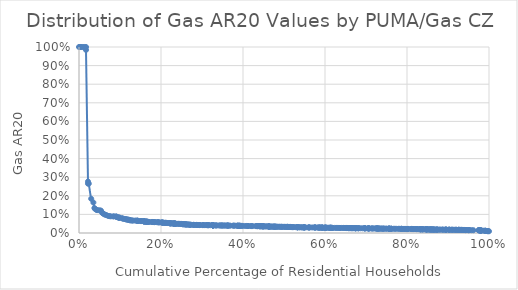
| Category | AR20_gas |
|---|---|
| 1.07221961974995e-06 | 1 |
| 0.00229821348100612 | 1 |
| 0.00495956144478507 | 1 |
| 0.00914545835981477 | 1 |
| 0.0128140702190956 | 1 |
| 0.0170680034945832 | 1 |
| 0.0170727015459645 | 0.984 |
| 0.0219218501013144 | 0.277 |
| 0.0219221861391418 | 0.265 |
| 0.0238782995773975 | 0.265 |
| 0.0297063076322547 | 0.184 |
| 0.0350762595945656 | 0.164 |
| 0.0375487733970018 | 0.134 |
| 0.0399042815849126 | 0.128 |
| 0.0431721046350667 | 0.124 |
| 0.0445546733369328 | 0.123 |
| 0.0498333489754946 | 0.122 |
| 0.053637433487389 | 0.12 |
| 0.0570916689322593 | 0.109 |
| 0.0570957579415493 | 0.107 |
| 0.0604774436069643 | 0.102 |
| 0.0633326286990549 | 0.098 |
| 0.0666840813338274 | 0.096 |
| 0.0708823360171524 | 0.092 |
| 0.0741296233131863 | 0.091 |
| 0.0774314246008016 | 0.09 |
| 0.0834084389524328 | 0.089 |
| 0.0853850144532829 | 0.089 |
| 0.0906554605272265 | 0.089 |
| 0.0909734117919871 | 0.088 |
| 0.0915695404561655 | 0.087 |
| 0.0942895828025872 | 0.084 |
| 0.0953060748716451 | 0.084 |
| 0.0984847313474749 | 0.083 |
| 0.0984847355122949 | 0.082 |
| 0.0984863683871913 | 0.082 |
| 0.105130470739923 | 0.08 |
| 0.107149330250677 | 0.076 |
| 0.110971298557398 | 0.076 |
| 0.113926304413762 | 0.074 |
| 0.113926386207292 | 0.074 |
| 0.117500291207898 | 0.074 |
| 0.117878088989415 | 0.071 |
| 0.121301221283638 | 0.071 |
| 0.121576998012026 | 0.071 |
| 0.124241406715937 | 0.069 |
| 0.124243061011068 | 0.069 |
| 0.124295362795494 | 0.068 |
| 0.127086856509742 | 0.068 |
| 0.129795324287599 | 0.067 |
| 0.131597916541999 | 0.067 |
| 0.136994132831474 | 0.067 |
| 0.140434609438351 | 0.066 |
| 0.142663597241338 | 0.066 |
| 0.142668424651051 | 0.066 |
| 0.143123789897546 | 0.065 |
| 0.145659852043393 | 0.065 |
| 0.150760001096954 | 0.064 |
| 0.151354902251628 | 0.064 |
| 0.153232376307528 | 0.064 |
| 0.157517354116171 | 0.064 |
| 0.157517355531586 | 0.063 |
| 0.159366279195612 | 0.063 |
| 0.159366381938477 | 0.062 |
| 0.159366390749053 | 0.062 |
| 0.159367736940809 | 0.062 |
| 0.161773311087287 | 0.061 |
| 0.164467431703901 | 0.061 |
| 0.164467431836481 | 0.061 |
| 0.165356145862274 | 0.061 |
| 0.165356356501126 | 0.06 |
| 0.166342619954551 | 0.06 |
| 0.166367857257938 | 0.06 |
| 0.16985393023808 | 0.06 |
| 0.169853931214702 | 0.059 |
| 0.175934673138637 | 0.059 |
| 0.179551097115245 | 0.059 |
| 0.180666957547139 | 0.059 |
| 0.180666965294076 | 0.059 |
| 0.183389938676059 | 0.059 |
| 0.184244937842272 | 0.059 |
| 0.18862586970693 | 0.059 |
| 0.192714094420495 | 0.058 |
| 0.192715718808669 | 0.057 |
| 0.194997710859526 | 0.057 |
| 0.198409764934514 | 0.057 |
| 0.20275278138085 | 0.057 |
| 0.202752786993327 | 0.056 |
| 0.202753202190336 | 0.056 |
| 0.205021124487211 | 0.056 |
| 0.205021137208874 | 0.055 |
| 0.207079700849243 | 0.055 |
| 0.210325709612666 | 0.055 |
| 0.210325711256483 | 0.054 |
| 0.210325712347611 | 0.054 |
| 0.212969342613954 | 0.054 |
| 0.212969342995228 | 0.054 |
| 0.216511229811084 | 0.054 |
| 0.219279633012634 | 0.053 |
| 0.221842385808467 | 0.053 |
| 0.221899760518096 | 0.053 |
| 0.221899775014913 | 0.053 |
| 0.221903272887168 | 0.053 |
| 0.22190327420566 | 0.053 |
| 0.222284717693405 | 0.052 |
| 0.222284717703745 | 0.052 |
| 0.225039621912991 | 0.052 |
| 0.225039639587967 | 0.051 |
| 0.229015744185198 | 0.051 |
| 0.229774970634997 | 0.051 |
| 0.229774973747062 | 0.051 |
| 0.232806664876912 | 0.051 |
| 0.232985156776789 | 0.051 |
| 0.233023216914966 | 0.051 |
| 0.233023220166908 | 0.051 |
| 0.233384410814453 | 0.05 |
| 0.2333898686957 | 0.05 |
| 0.233390181970958 | 0.05 |
| 0.236155425920881 | 0.05 |
| 0.236749183569731 | 0.049 |
| 0.241138220060792 | 0.049 |
| 0.243436032559588 | 0.049 |
| 0.245991212025901 | 0.049 |
| 0.249370177762803 | 0.049 |
| 0.249370177882291 | 0.048 |
| 0.252065707128243 | 0.048 |
| 0.252092780757566 | 0.048 |
| 0.252336226693037 | 0.048 |
| 0.25234129769636 | 0.047 |
| 0.255815766408475 | 0.047 |
| 0.255815766964418 | 0.047 |
| 0.255858216361787 | 0.047 |
| 0.2578056115267 | 0.047 |
| 0.259742548926753 | 0.047 |
| 0.261138539727034 | 0.046 |
| 0.261532090078019 | 0.046 |
| 0.261532090084688 | 0.046 |
| 0.264553827874726 | 0.046 |
| 0.266084641521215 | 0.046 |
| 0.267815669861857 | 0.045 |
| 0.270593608622219 | 0.045 |
| 0.27088969339816 | 0.044 |
| 0.270906796983555 | 0.044 |
| 0.27435142920925 | 0.044 |
| 0.27903495240882 | 0.044 |
| 0.280348485362342 | 0.044 |
| 0.280555743642689 | 0.044 |
| 0.286716241098927 | 0.043 |
| 0.286719402378244 | 0.043 |
| 0.286770067947642 | 0.043 |
| 0.289793891210786 | 0.043 |
| 0.293843465525211 | 0.043 |
| 0.293866865376495 | 0.043 |
| 0.294205505302198 | 0.043 |
| 0.300890932124682 | 0.043 |
| 0.302617258870653 | 0.043 |
| 0.30261726331832 | 0.042 |
| 0.305538459456675 | 0.042 |
| 0.30960334605505 | 0.042 |
| 0.312525499456254 | 0.042 |
| 0.312531741853673 | 0.042 |
| 0.313224067947704 | 0.042 |
| 0.31602609831227 | 0.042 |
| 0.316026098312277 | 0.042 |
| 0.320193459585009 | 0.042 |
| 0.326077979653003 | 0.042 |
| 0.326077980576515 | 0.042 |
| 0.326079907208463 | 0.042 |
| 0.326080332019684 | 0.042 |
| 0.326081624671854 | 0.041 |
| 0.3260816246977 | 0.041 |
| 0.326088504138804 | 0.041 |
| 0.326742455122537 | 0.041 |
| 0.32688548440133 | 0.041 |
| 0.326887345700056 | 0.041 |
| 0.326892810803274 | 0.041 |
| 0.326894066683298 | 0.041 |
| 0.326894066696052 | 0.041 |
| 0.328283247870449 | 0.041 |
| 0.333321364848149 | 0.041 |
| 0.333323392898359 | 0.041 |
| 0.336030110988338 | 0.041 |
| 0.340967442799731 | 0.041 |
| 0.345111175249178 | 0.041 |
| 0.345111192334561 | 0.04 |
| 0.348261164688001 | 0.04 |
| 0.349379495713091 | 0.04 |
| 0.351149042784586 | 0.04 |
| 0.355128935069928 | 0.04 |
| 0.355448829267696 | 0.04 |
| 0.360276325762677 | 0.04 |
| 0.36089639270179 | 0.04 |
| 0.362942360405995 | 0.04 |
| 0.362943177457352 | 0.04 |
| 0.363513653648535 | 0.04 |
| 0.366221169476838 | 0.04 |
| 0.369095963513591 | 0.04 |
| 0.376299383425574 | 0.039 |
| 0.377265328641615 | 0.039 |
| 0.380548674010209 | 0.039 |
| 0.386022208700038 | 0.039 |
| 0.387357798298135 | 0.039 |
| 0.387358758765987 | 0.039 |
| 0.387358759304785 | 0.039 |
| 0.389826169163444 | 0.039 |
| 0.389832778336073 | 0.039 |
| 0.39179692574107 | 0.039 |
| 0.392457885529537 | 0.039 |
| 0.392458276539528 | 0.039 |
| 0.392458282084949 | 0.039 |
| 0.397135192886427 | 0.038 |
| 0.397999608421589 | 0.038 |
| 0.403871190771162 | 0.038 |
| 0.408248648741379 | 0.038 |
| 0.412239773057733 | 0.038 |
| 0.412240045564753 | 0.038 |
| 0.412240045564805 | 0.037 |
| 0.419231090411133 | 0.037 |
| 0.420933009572028 | 0.037 |
| 0.423596812652653 | 0.037 |
| 0.431086623107177 | 0.037 |
| 0.432499173242644 | 0.037 |
| 0.434762161598998 | 0.037 |
| 0.434762161599005 | 0.037 |
| 0.434762208153378 | 0.037 |
| 0.437027659452751 | 0.037 |
| 0.441032391076984 | 0.037 |
| 0.441032415842248 | 0.037 |
| 0.441582690644422 | 0.037 |
| 0.441613722043656 | 0.037 |
| 0.441613732173857 | 0.037 |
| 0.441614803755935 | 0.036 |
| 0.443896006644949 | 0.036 |
| 0.446837592929059 | 0.036 |
| 0.446872993175616 | 0.036 |
| 0.44687299317707 | 0.036 |
| 0.449844345203343 | 0.036 |
| 0.449873299286843 | 0.036 |
| 0.449878115079621 | 0.036 |
| 0.449990762192102 | 0.036 |
| 0.454794489147716 | 0.036 |
| 0.456616190849116 | 0.036 |
| 0.460385204964723 | 0.035 |
| 0.460776435422929 | 0.035 |
| 0.463161572116121 | 0.035 |
| 0.463161572919477 | 0.035 |
| 0.463179356953205 | 0.035 |
| 0.463796245760843 | 0.035 |
| 0.463796245795549 | 0.035 |
| 0.463840202124383 | 0.035 |
| 0.465221047882297 | 0.034 |
| 0.468162473354882 | 0.034 |
| 0.468205479998807 | 0.034 |
| 0.471519280172202 | 0.034 |
| 0.473814808363266 | 0.034 |
| 0.474721269534296 | 0.034 |
| 0.474721269538523 | 0.034 |
| 0.477841404722715 | 0.034 |
| 0.47784157506852 | 0.034 |
| 0.47786836675818 | 0.034 |
| 0.479396822980544 | 0.034 |
| 0.482690441109342 | 0.034 |
| 0.482725301158768 | 0.034 |
| 0.486993257882883 | 0.034 |
| 0.489340442603009 | 0.034 |
| 0.492352113960485 | 0.033 |
| 0.494508714172082 | 0.033 |
| 0.494821102214574 | 0.033 |
| 0.49816121642525 | 0.033 |
| 0.502097864895892 | 0.033 |
| 0.502285084625378 | 0.033 |
| 0.505653217805019 | 0.033 |
| 0.50867661914887 | 0.033 |
| 0.50921167343582 | 0.033 |
| 0.509211830484392 | 0.033 |
| 0.509214033439142 | 0.033 |
| 0.512970792939347 | 0.033 |
| 0.515875758469227 | 0.032 |
| 0.515876356829089 | 0.032 |
| 0.515876948598935 | 0.032 |
| 0.517886273398197 | 0.032 |
| 0.521126778255708 | 0.032 |
| 0.521128407797599 | 0.032 |
| 0.523471865801551 | 0.032 |
| 0.527681518805049 | 0.032 |
| 0.532330967986976 | 0.032 |
| 0.532344097545549 | 0.031 |
| 0.532344264404888 | 0.031 |
| 0.532353390166678 | 0.031 |
| 0.532355758177682 | 0.031 |
| 0.53293922577067 | 0.031 |
| 0.532939779294352 | 0.031 |
| 0.537260379074112 | 0.031 |
| 0.537260382950928 | 0.031 |
| 0.541020060424672 | 0.031 |
| 0.544742911951681 | 0.03 |
| 0.544757639241748 | 0.03 |
| 0.549092439645964 | 0.03 |
| 0.549092439719184 | 0.03 |
| 0.549361012319747 | 0.03 |
| 0.549393921008242 | 0.03 |
| 0.549393933065349 | 0.03 |
| 0.552511628513161 | 0.03 |
| 0.559284746157375 | 0.03 |
| 0.561293869852034 | 0.03 |
| 0.561432421776985 | 0.03 |
| 0.562488190935126 | 0.03 |
| 0.568752213069486 | 0.03 |
| 0.573192299036748 | 0.03 |
| 0.575602712308159 | 0.03 |
| 0.575746566414193 | 0.03 |
| 0.575746764906252 | 0.03 |
| 0.578655555747378 | 0.03 |
| 0.583388373500017 | 0.029 |
| 0.583388617114383 | 0.029 |
| 0.586916103459222 | 0.029 |
| 0.58691806456389 | 0.029 |
| 0.586918067304262 | 0.029 |
| 0.587250009627688 | 0.029 |
| 0.591780606787383 | 0.029 |
| 0.593010436126723 | 0.029 |
| 0.593015026709664 | 0.029 |
| 0.59301529966119 | 0.029 |
| 0.593015299815065 | 0.029 |
| 0.595157227189415 | 0.029 |
| 0.599161556498504 | 0.029 |
| 0.599167089676147 | 0.029 |
| 0.59935850242068 | 0.029 |
| 0.601789683962211 | 0.028 |
| 0.601792294790196 | 0.028 |
| 0.60192060226083 | 0.028 |
| 0.601920629756658 | 0.028 |
| 0.605266751936125 | 0.028 |
| 0.608474641553173 | 0.028 |
| 0.611023720944634 | 0.028 |
| 0.611337214577323 | 0.028 |
| 0.613674135016477 | 0.028 |
| 0.613743562648117 | 0.028 |
| 0.613827537302831 | 0.028 |
| 0.613827537382773 | 0.028 |
| 0.615125965251715 | 0.028 |
| 0.615241764245742 | 0.028 |
| 0.615241960117589 | 0.028 |
| 0.615726074035001 | 0.027 |
| 0.618476463390624 | 0.027 |
| 0.618492618162101 | 0.027 |
| 0.62371484997839 | 0.027 |
| 0.627280386085864 | 0.027 |
| 0.629855155287473 | 0.027 |
| 0.633679099885903 | 0.027 |
| 0.636618182728161 | 0.027 |
| 0.636618184742006 | 0.027 |
| 0.64021530744344 | 0.027 |
| 0.645288081642428 | 0.027 |
| 0.64528808300205 | 0.027 |
| 0.649291411132555 | 0.027 |
| 0.652824753747026 | 0.027 |
| 0.652825440044435 | 0.027 |
| 0.653379819004403 | 0.027 |
| 0.653379819562387 | 0.027 |
| 0.656979399223185 | 0.027 |
| 0.657255615299725 | 0.026 |
| 0.657285864698279 | 0.026 |
| 0.657288097155678 | 0.026 |
| 0.65991775887736 | 0.026 |
| 0.65991782358389 | 0.026 |
| 0.663253433089345 | 0.026 |
| 0.663265137426479 | 0.026 |
| 0.663265138914723 | 0.026 |
| 0.663994138326373 | 0.026 |
| 0.664006256729138 | 0.026 |
| 0.665777993491488 | 0.026 |
| 0.667907845771761 | 0.026 |
| 0.667907853092715 | 0.026 |
| 0.670609645104058 | 0.026 |
| 0.672335067692401 | 0.026 |
| 0.674614962186534 | 0.026 |
| 0.674615093927397 | 0.026 |
| 0.674615112333588 | 0.026 |
| 0.674615145031048 | 0.026 |
| 0.674615512409332 | 0.026 |
| 0.677967906916804 | 0.026 |
| 0.681613061002777 | 0.026 |
| 0.681613147269915 | 0.026 |
| 0.681613147273758 | 0.026 |
| 0.686403824339672 | 0.026 |
| 0.691368727598381 | 0.025 |
| 0.696666533081153 | 0.025 |
| 0.696666533820158 | 0.025 |
| 0.69666670406986 | 0.025 |
| 0.696666827618111 | 0.025 |
| 0.699456690185913 | 0.025 |
| 0.705290547745695 | 0.025 |
| 0.705295733514177 | 0.025 |
| 0.70636153483696 | 0.025 |
| 0.706838118408566 | 0.025 |
| 0.706838142291256 | 0.025 |
| 0.707181113646209 | 0.025 |
| 0.712282092634874 | 0.025 |
| 0.714570955401888 | 0.025 |
| 0.716334500884775 | 0.025 |
| 0.718040777192051 | 0.024 |
| 0.722219123934636 | 0.024 |
| 0.725007901582617 | 0.024 |
| 0.725008724969839 | 0.024 |
| 0.726778198674208 | 0.024 |
| 0.72677917203109 | 0.024 |
| 0.727172763296863 | 0.024 |
| 0.729511105465401 | 0.024 |
| 0.729511178251728 | 0.024 |
| 0.729511202227091 | 0.024 |
| 0.732228759693577 | 0.024 |
| 0.733149847712782 | 0.024 |
| 0.733149864342487 | 0.024 |
| 0.736864921530359 | 0.024 |
| 0.739227168042598 | 0.024 |
| 0.739410918826185 | 0.023 |
| 0.743077239383621 | 0.023 |
| 0.743104448722403 | 0.023 |
| 0.743109247840867 | 0.023 |
| 0.748756417301789 | 0.023 |
| 0.749339367768194 | 0.023 |
| 0.753628799763279 | 0.023 |
| 0.756476281626525 | 0.023 |
| 0.756476281942551 | 0.023 |
| 0.756491537978399 | 0.023 |
| 0.756738561117731 | 0.023 |
| 0.756738561840455 | 0.023 |
| 0.75674089306485 | 0.023 |
| 0.76112417006406 | 0.023 |
| 0.761184612479552 | 0.023 |
| 0.7611887151065 | 0.023 |
| 0.762202360668921 | 0.023 |
| 0.767342948372041 | 0.023 |
| 0.770637685764944 | 0.023 |
| 0.773990122861736 | 0.023 |
| 0.779012190278358 | 0.023 |
| 0.781355104264966 | 0.022 |
| 0.785160438319082 | 0.022 |
| 0.786552514520182 | 0.022 |
| 0.786553684564916 | 0.022 |
| 0.786592176012654 | 0.022 |
| 0.789940021955456 | 0.022 |
| 0.792498847470757 | 0.022 |
| 0.795433543796683 | 0.022 |
| 0.795433700936541 | 0.022 |
| 0.800000928285368 | 0.022 |
| 0.801984432075593 | 0.022 |
| 0.801984603613322 | 0.022 |
| 0.804319703030757 | 0.022 |
| 0.811441107469556 | 0.022 |
| 0.811441110633898 | 0.022 |
| 0.811441110759543 | 0.022 |
| 0.811441436505019 | 0.021 |
| 0.814220342644542 | 0.021 |
| 0.81422327372369 | 0.021 |
| 0.815215334273299 | 0.021 |
| 0.815229799654418 | 0.021 |
| 0.819283789707731 | 0.021 |
| 0.822910997804109 | 0.021 |
| 0.822912044479358 | 0.021 |
| 0.822964632870015 | 0.021 |
| 0.825982163583479 | 0.021 |
| 0.82836750161057 | 0.021 |
| 0.832290042213988 | 0.021 |
| 0.832290059123317 | 0.021 |
| 0.832290059696567 | 0.021 |
| 0.832515816985439 | 0.02 |
| 0.832516112773234 | 0.02 |
| 0.832516113104098 | 0.02 |
| 0.832516745970806 | 0.02 |
| 0.83640379633705 | 0.02 |
| 0.836417864323441 | 0.02 |
| 0.836538111909661 | 0.02 |
| 0.836542659107647 | 0.02 |
| 0.838461429257625 | 0.02 |
| 0.838461429304627 | 0.02 |
| 0.841117883272673 | 0.02 |
| 0.843823575281632 | 0.02 |
| 0.846527488137044 | 0.02 |
| 0.847312386950801 | 0.02 |
| 0.84731959676152 | 0.02 |
| 0.84731997487849 | 0.02 |
| 0.847320006125475 | 0.02 |
| 0.847459671162167 | 0.02 |
| 0.849748913791435 | 0.02 |
| 0.849749117685095 | 0.02 |
| 0.849749120632461 | 0.019 |
| 0.853317325987011 | 0.019 |
| 0.853317501066769 | 0.019 |
| 0.856560661008072 | 0.019 |
| 0.856560681206261 | 0.019 |
| 0.856563975199822 | 0.019 |
| 0.858794156294264 | 0.019 |
| 0.858861040345029 | 0.019 |
| 0.85953964954744 | 0.019 |
| 0.862507745701514 | 0.019 |
| 0.862508265819215 | 0.019 |
| 0.862508613539213 | 0.019 |
| 0.862508629606135 | 0.019 |
| 0.866343015436175 | 0.018 |
| 0.866343707371945 | 0.018 |
| 0.866344892052841 | 0.018 |
| 0.869720925803677 | 0.018 |
| 0.869721004808354 | 0.018 |
| 0.872803414325538 | 0.018 |
| 0.872803692055777 | 0.018 |
| 0.872804040096953 | 0.018 |
| 0.875011724616914 | 0.018 |
| 0.875040980350645 | 0.018 |
| 0.880175596091814 | 0.018 |
| 0.880175596738599 | 0.018 |
| 0.886142928224869 | 0.018 |
| 0.886142976060211 | 0.018 |
| 0.888536579117395 | 0.018 |
| 0.891891155404031 | 0.018 |
| 0.894922836171371 | 0.018 |
| 0.894922966101893 | 0.018 |
| 0.894923014613967 | 0.018 |
| 0.894923157411697 | 0.018 |
| 0.895714178965701 | 0.018 |
| 0.901135617667572 | 0.018 |
| 0.903463471986909 | 0.018 |
| 0.903477387972425 | 0.018 |
| 0.90347741631854 | 0.018 |
| 0.908399155334733 | 0.017 |
| 0.910579315633557 | 0.017 |
| 0.91057932260079 | 0.017 |
| 0.913726496655287 | 0.017 |
| 0.917572071685858 | 0.017 |
| 0.918114257755739 | 0.017 |
| 0.920708250430213 | 0.017 |
| 0.920708896981811 | 0.017 |
| 0.925677522134856 | 0.017 |
| 0.925679384772384 | 0.017 |
| 0.925679438010253 | 0.017 |
| 0.928453977903523 | 0.017 |
| 0.928459710500378 | 0.017 |
| 0.931352376279669 | 0.017 |
| 0.933886561416135 | 0.017 |
| 0.933907653346549 | 0.017 |
| 0.933907829669233 | 0.017 |
| 0.936787954580697 | 0.017 |
| 0.938853304700874 | 0.016 |
| 0.938853644086205 | 0.016 |
| 0.939019425170748 | 0.016 |
| 0.939019429896868 | 0.016 |
| 0.942028494006709 | 0.016 |
| 0.942797718434425 | 0.016 |
| 0.942802044411159 | 0.016 |
| 0.942804072620857 | 0.016 |
| 0.945961373300156 | 0.016 |
| 0.949859032360062 | 0.015 |
| 0.949859593709598 | 0.015 |
| 0.951171410755644 | 0.015 |
| 0.953073491754978 | 0.015 |
| 0.95739512650266 | 0.015 |
| 0.961890070770381 | 0.015 |
| 0.974646018730985 | 0.015 |
| 0.974958944307622 | 0.015 |
| 0.974963981809745 | 0.015 |
| 0.977506995957778 | 0.014 |
| 0.977507960322101 | 0.014 |
| 0.977507960664295 | 0.014 |
| 0.977519185006425 | 0.014 |
| 0.977519823343081 | 0.014 |
| 0.980143477317847 | 0.014 |
| 0.980144967310675 | 0.014 |
| 0.980165943620561 | 0.013 |
| 0.98016594365386 | 0.013 |
| 0.980165945120759 | 0.013 |
| 0.983507542222779 | 0.013 |
| 0.987703640294501 | 0.012 |
| 0.991217323881366 | 0.012 |
| 0.991218057292518 | 0.012 |
| 0.991220546820237 | 0.012 |
| 0.993543570085723 | 0.011 |
| 0.997255445679655 | 0.011 |
| 0.997259730391861 | 0.01 |
| 0.997277150712509 | 0.01 |
| 1.0 | 0.009 |